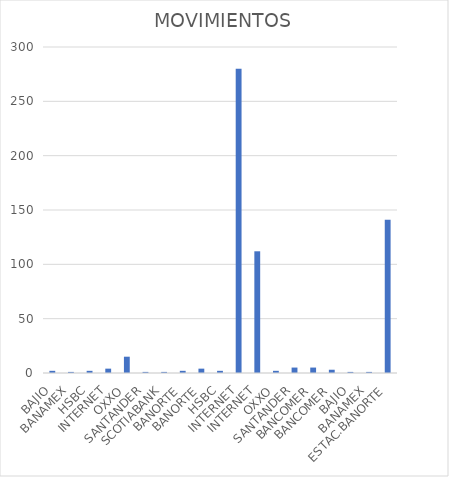
| Category | MOVIMIENTOS |
|---|---|
| BAJIO | 2 |
| BANAMEX | 1 |
| HSBC | 2 |
| INTERNET | 4 |
| OXXO | 15 |
| SANTANDER | 1 |
| SCOTIABANK | 1 |
| BANORTE | 2 |
| BANORTE | 4 |
| HSBC | 2 |
| INTERNET | 280 |
| INTERNET | 112 |
| OXXO | 2 |
| SANTANDER | 5 |
| BANCOMER | 5 |
| BANCOMER | 3 |
| BAJIO | 1 |
| BANAMEX | 1 |
| ESTAC.BANORTE | 141 |